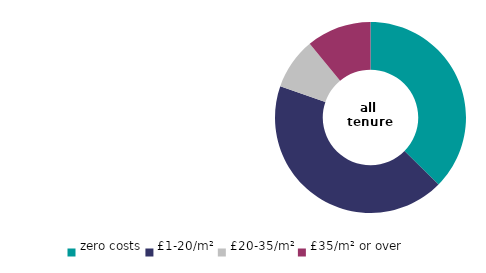
| Category | all 
tenures |
|---|---|
| zero costs | 37.388 |
| £1-20/m² | 42.915 |
| £20-35/m² | 8.72 |
| £35/m² or over | 10.977 |